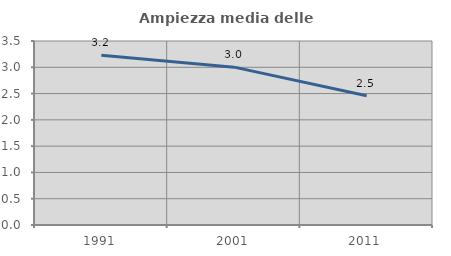
| Category | Ampiezza media delle famiglie |
|---|---|
| 1991.0 | 3.229 |
| 2001.0 | 3.003 |
| 2011.0 | 2.457 |